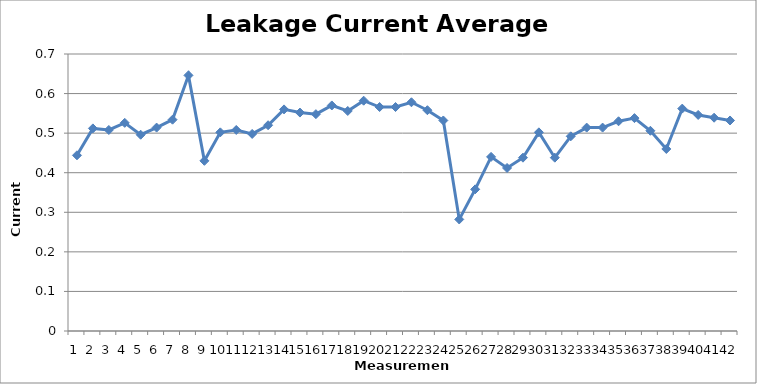
| Category | Leakage Current Average [pA] |
|---|---|
| 0 | 0.444 |
| 1 | 0.512 |
| 2 | 0.508 |
| 3 | 0.526 |
| 4 | 0.496 |
| 5 | 0.514 |
| 6 | 0.534 |
| 7 | 0.646 |
| 8 | 0.43 |
| 9 | 0.502 |
| 10 | 0.508 |
| 11 | 0.498 |
| 12 | 0.52 |
| 13 | 0.56 |
| 14 | 0.552 |
| 15 | 0.548 |
| 16 | 0.57 |
| 17 | 0.556 |
| 18 | 0.582 |
| 19 | 0.566 |
| 20 | 0.566 |
| 21 | 0.578 |
| 22 | 0.558 |
| 23 | 0.532 |
| 24 | 0.282 |
| 25 | 0.358 |
| 26 | 0.44 |
| 27 | 0.412 |
| 28 | 0.438 |
| 29 | 0.502 |
| 30 | 0.438 |
| 31 | 0.492 |
| 32 | 0.514 |
| 33 | 0.514 |
| 34 | 0.53 |
| 35 | 0.538 |
| 36 | 0.506 |
| 37 | 0.46 |
| 38 | 0.562 |
| 39 | 0.546 |
| 40 | 0.539 |
| 41 | 0.532 |